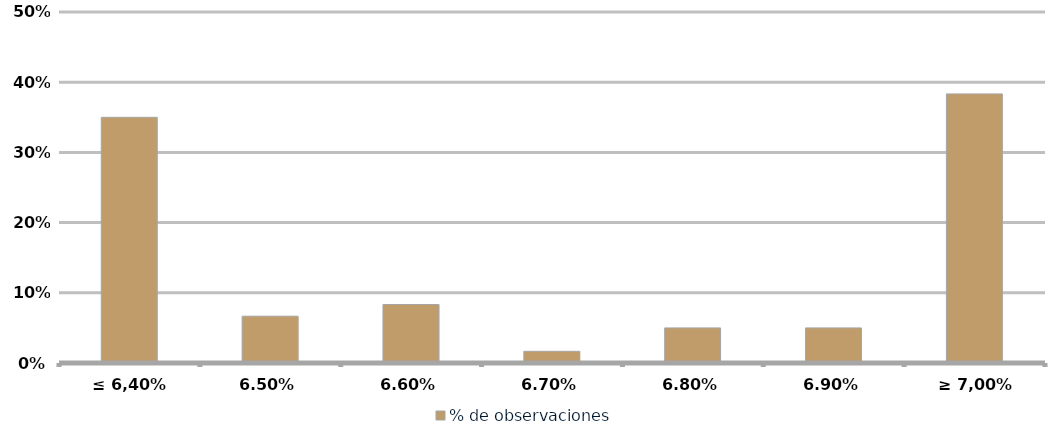
| Category | % de observaciones  |
|---|---|
| ≤ 6,40% | 0.35 |
| 6,50% | 0.067 |
| 6,60% | 0.083 |
| 6,70% | 0.017 |
| 6,80% | 0.05 |
| 6,90% | 0.05 |
| ≥ 7,00% | 0.383 |